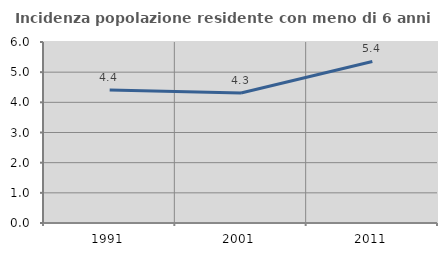
| Category | Incidenza popolazione residente con meno di 6 anni |
|---|---|
| 1991.0 | 4.412 |
| 2001.0 | 4.311 |
| 2011.0 | 5.355 |